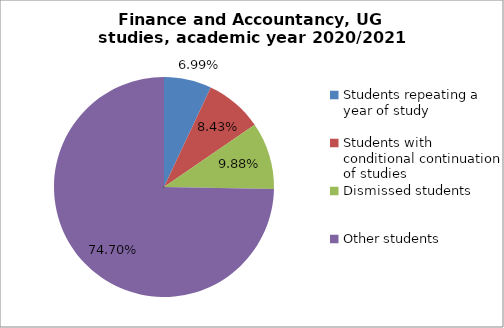
| Category | Series 0 |
|---|---|
| Students repeating a year of study | 29 |
| Students with conditional continuation of studies | 35 |
| Dismissed students | 41 |
| Other students | 310 |